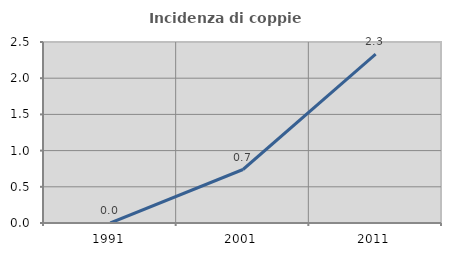
| Category | Incidenza di coppie miste |
|---|---|
| 1991.0 | 0 |
| 2001.0 | 0.739 |
| 2011.0 | 2.332 |